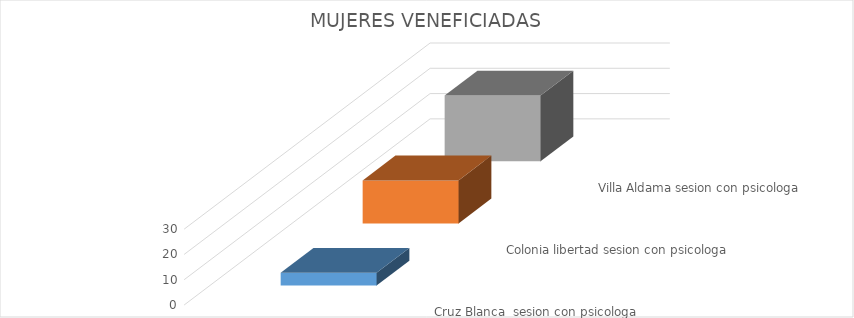
| Category | Cruz Blanca  sesion con psicologa | Colonia libertad sesion con psicologa | Villa Aldama sesion con psicologa |
|---|---|---|---|
| Mujeres veneficiadas | 5 | 17 | 26 |